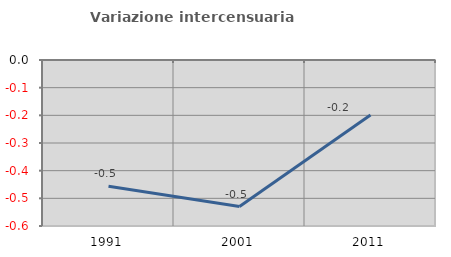
| Category | Variazione intercensuaria annua |
|---|---|
| 1991.0 | -0.456 |
| 2001.0 | -0.53 |
| 2011.0 | -0.199 |